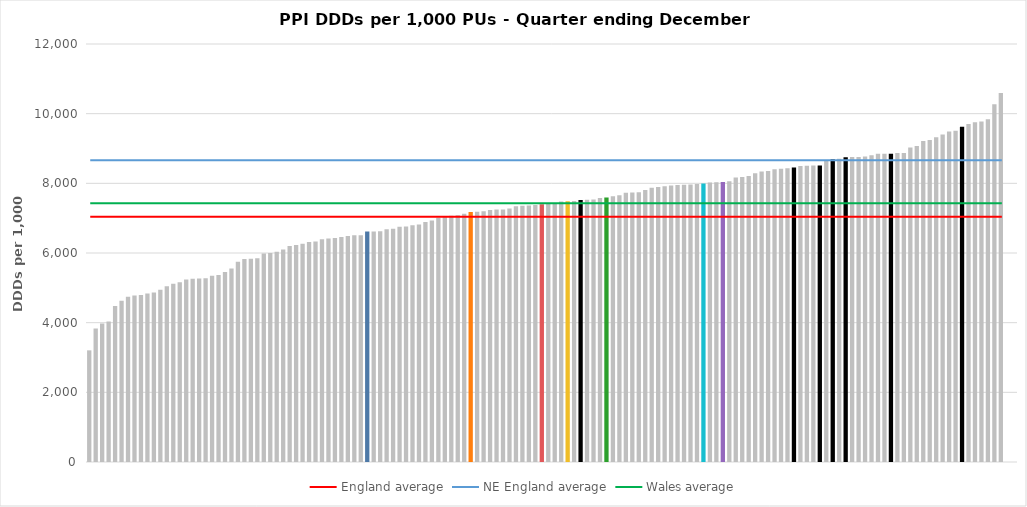
| Category | Series 0 |
|---|---|
| English CCGs | 3205.614 |
| English CCGs | 3834.346 |
| English CCGs | 3975.376 |
| English CCGs | 4036.536 |
| English CCGs | 4475.46 |
| English CCGs | 4631.56 |
| English CCGs | 4743.802 |
| English CCGs | 4776.462 |
| English CCGs | 4791.69 |
| English CCGs | 4840.804 |
| English CCGs | 4865.357 |
| English CCGs | 4947.772 |
| English CCGs | 5044.348 |
| English CCGs | 5120.302 |
| English CCGs | 5158.274 |
| English CCGs | 5241.926 |
| English CCGs | 5259.561 |
| English CCGs | 5265.341 |
| English CCGs | 5271.697 |
| English CCGs | 5343.504 |
| English CCGs | 5365.39 |
| English CCGs | 5452.806 |
| English CCGs | 5551.783 |
| English CCGs | 5746.959 |
| English CCGs | 5825.171 |
| English CCGs | 5831.81 |
| English CCGs | 5850.104 |
| English CCGs | 5983.987 |
| English CCGs | 6002.34 |
| English CCGs | 6037.137 |
| English CCGs | 6097.866 |
| English CCGs | 6199.592 |
| English CCGs | 6231.811 |
| English CCGs | 6268.659 |
| English CCGs | 6313.943 |
| English CCGs | 6327.586 |
| English CCGs | 6391.162 |
| English CCGs | 6414.711 |
| English CCGs | 6431.503 |
| English CCGs | 6461.619 |
| English CCGs | 6489.077 |
| English CCGs | 6508.075 |
| English CCGs | 6509.611 |
| Cardiff and Vale | 6616.654 |
| English CCGs | 6619.989 |
| English CCGs | 6624.19 |
| English CCGs | 6678.428 |
| English CCGs | 6698.564 |
| English CCGs | 6756.713 |
| English CCGs | 6762.052 |
| English CCGs | 6796.432 |
| English CCGs | 6817.928 |
| English CCGs | 6889.338 |
| English CCGs | 6936.488 |
| English CCGs | 7011.045 |
| English CCGs | 7034.39 |
| English CCGs | 7068.441 |
| English CCGs | 7080.858 |
| English CCGs | 7123.587 |
| Swansea Bay UHB | 7178.814 |
| English CCGs | 7186.617 |
| English CCGs | 7199.602 |
| English CCGs | 7233.992 |
| English CCGs | 7251.195 |
| English CCGs | 7251.966 |
| English CCGs | 7276.03 |
| English CCGs | 7340.197 |
| English CCGs | 7358.163 |
| English CCGs | 7360.702 |
| English CCGs | 7376.235 |
| Hywel Dda | 7398.225 |
| English CCGs | 7419.037 |
| English CCGs | 7421.812 |
| English CCGs | 7481.444 |
| Aneurin Bevan | 7482.133 |
| English CCGs | 7494.189 |
| NE England | 7522.831 |
| English CCGs | 7525.538 |
| English CCGs | 7535.829 |
| English CCGs | 7580.117 |
| BCU | 7590.825 |
| English CCGs | 7631.674 |
| English CCGs | 7655.648 |
| English CCGs | 7730.239 |
| English CCGs | 7739.921 |
| English CCGs | 7743.828 |
| English CCGs | 7806.542 |
| English CCGs | 7871.075 |
| English CCGs | 7895.778 |
| English CCGs | 7914.847 |
| English CCGs | 7940.111 |
| English CCGs | 7951.314 |
| English CCGs | 7956.646 |
| English CCGs | 7967.856 |
| English CCGs | 7982.38 |
| Cwm Taf Morgannwg UHB | 7997.699 |
| English CCGs | 8023.154 |
| English CCGs | 8033.733 |
| Powys  | 8037.552 |
| English CCGs | 8056.411 |
| English CCGs | 8166.514 |
| English CCGs | 8184.754 |
| English CCGs | 8211.518 |
| English CCGs | 8292.687 |
| English CCGs | 8342.588 |
| English CCGs | 8356.658 |
| English CCGs | 8403.796 |
| English CCGs | 8416.517 |
| English CCGs | 8435.597 |
| NE England | 8457.003 |
| English CCGs | 8500.33 |
| English CCGs | 8507.305 |
| English CCGs | 8509.104 |
| NE England | 8513.323 |
| English CCGs | 8655.15 |
| NE England | 8693.892 |
| English CCGs | 8706.338 |
| NE England | 8752.017 |
| English CCGs | 8752.911 |
| English CCGs | 8756.738 |
| English CCGs | 8769.076 |
| English CCGs | 8805.35 |
| English CCGs | 8847.654 |
| English CCGs | 8850.029 |
| NE England | 8852.383 |
| English CCGs | 8869.77 |
| English CCGs | 8871.916 |
| English CCGs | 9027.15 |
| English CCGs | 9072 |
| English CCGs | 9214.031 |
| English CCGs | 9241.85 |
| English CCGs | 9325.576 |
| English CCGs | 9405.493 |
| English CCGs | 9488.663 |
| English CCGs | 9506.066 |
| NE England | 9627.446 |
| English CCGs | 9706.597 |
| English CCGs | 9750.293 |
| English CCGs | 9778.486 |
| English CCGs | 9837.149 |
| English CCGs | 10268.943 |
| English CCGs | 10593.157 |